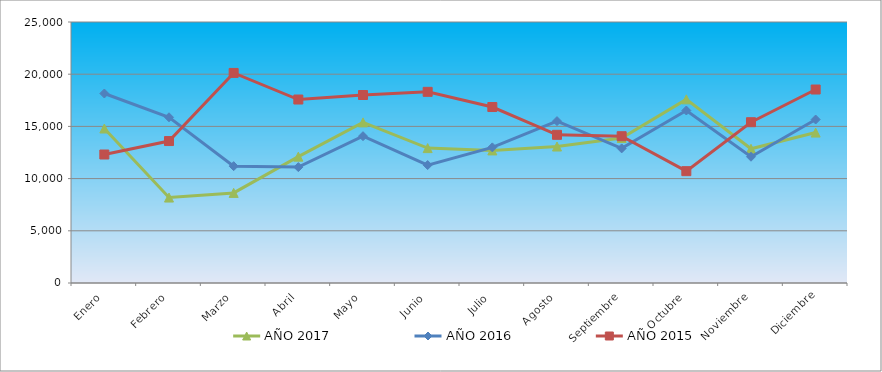
| Category | AÑO 2017 | AÑO 2016 | AÑO 2015 |
|---|---|---|---|
| Enero | 14797.835 | 18150.166 | 12308.201 |
| Febrero | 8184.712 | 15874.903 | 13596.09 |
| Marzo | 8629.888 | 11191.976 | 20121.477 |
| Abril | 12103.945 | 11101.113 | 17573.869 |
| Mayo | 15385.048 | 14062.922 | 18006.412 |
| Junio | 12920.942 | 11295.336 | 18310.743 |
| Julio | 12699.041 | 12992.229 | 16855.829 |
| Agosto | 13072.06 | 15508.182 | 14193.319 |
| Septiembre | 13886.549 | 12892.751 | 14060 |
| Octubre | 17591.725 | 16522.838 | 10711.703 |
| Noviembre | 12855.783 | 12093.442 | 15401.738 |
| Diciembre | 14409.137 | 15658.269 | 18532.635 |